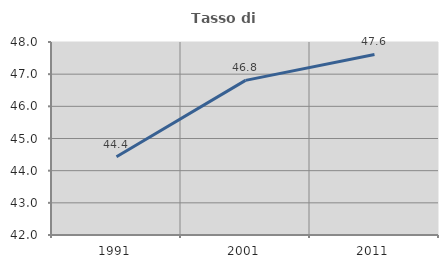
| Category | Tasso di occupazione   |
|---|---|
| 1991.0 | 44.433 |
| 2001.0 | 46.806 |
| 2011.0 | 47.614 |